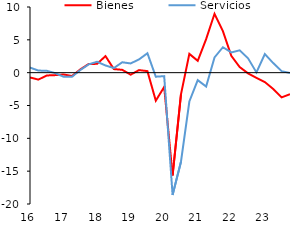
| Category | Bienes | Servicios |
|---|---|---|
| 2016-03-01 | -0.731 | 0.779 |
| 2016-06-01 | -1.057 | 0.32 |
| 2016-09-01 | -0.428 | 0.287 |
| 2016-12-01 | -0.373 | -0.075 |
| 2017-03-01 | -0.273 | -0.615 |
| 2017-06-01 | -0.513 | -0.635 |
| 2017-09-01 | 0.499 | 0.401 |
| 2017-12-01 | 1.325 | 1.266 |
| 2018-03-01 | 1.343 | 1.661 |
| 2018-06-01 | 2.519 | 1.097 |
| 2018-09-01 | 0.546 | 0.699 |
| 2018-12-01 | 0.433 | 1.586 |
| 2019-03-01 | -0.305 | 1.406 |
| 2019-06-01 | 0.39 | 2.021 |
| 2019-09-01 | 0.234 | 2.957 |
| 2019-12-01 | -4.267 | -0.616 |
| 2020-03-01 | -2.175 | -0.531 |
| 2020-06-01 | -15.659 | -18.619 |
| 2020-09-01 | -3.294 | -13.567 |
| 2020-12-01 | 2.857 | -4.391 |
| 2021-03-01 | 1.816 | -1.147 |
| 2021-06-01 | 5.1 | -2.101 |
| 2021-09-01 | 8.964 | 2.313 |
| 2021-12-01 | 6.331 | 3.876 |
| 2022-03-01 | 2.561 | 3.076 |
| 2022-06-01 | 0.861 | 3.391 |
| 2022-09-01 | -0.107 | 2.18 |
| 2022-12-01 | -0.777 | 0.034 |
| 2023-03-01 | -1.422 | 2.824 |
| 2023-06-01 | -2.497 | 1.463 |
| 2023-09-01 | -3.764 | 0.225 |
| 2023-12-01 | -3.294 | -0.044 |